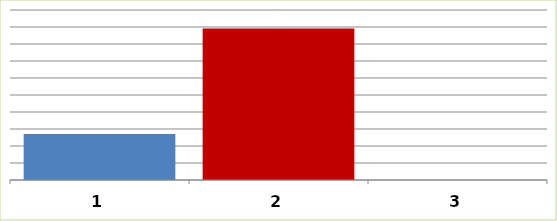
| Category | Series 0 |
|---|---|
| 0 | 54184106 |
| 1 | 178166341 |
| 2 | 0 |